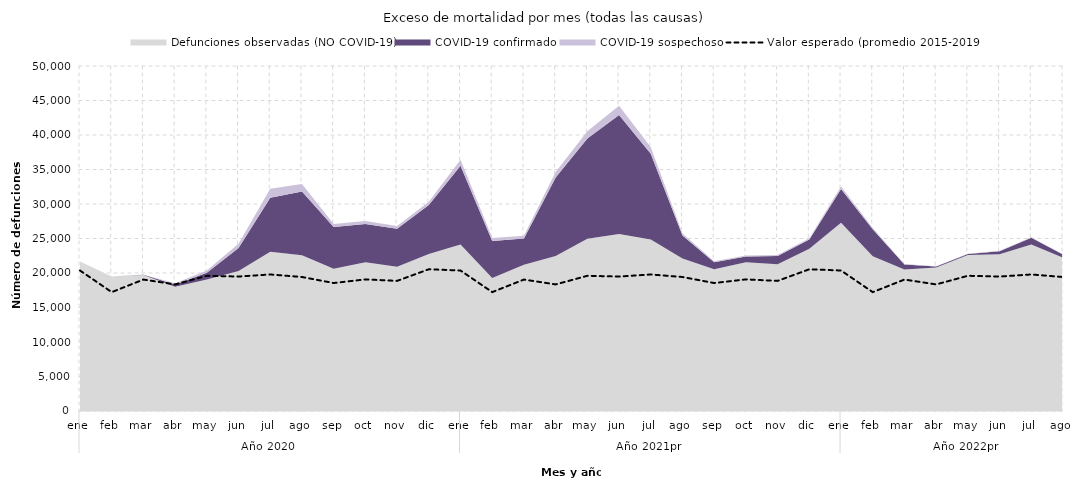
| Category | Valor esperado (promedio 2015-2019) |
|---|---|
| 0 | 20360.6 |
| 1 | 17229.2 |
| 2 | 19050 |
| 3 | 18346.2 |
| 4 | 19594.4 |
| 5 | 19486.2 |
| 6 | 19786.4 |
| 7 | 19420 |
| 8 | 18545.8 |
| 9 | 19074.4 |
| 10 | 18857 |
| 11 | 20542 |
| 12 | 20360.6 |
| 13 | 17229.2 |
| 14 | 19050 |
| 15 | 18346.2 |
| 16 | 19594.4 |
| 17 | 19486.2 |
| 18 | 19786.4 |
| 19 | 19420 |
| 20 | 18545.8 |
| 21 | 19074.4 |
| 22 | 18857 |
| 23 | 20542 |
| 24 | 20360.6 |
| 25 | 17229.2 |
| 26 | 19050 |
| 27 | 18346.2 |
| 28 | 19594.4 |
| 29 | 19486.2 |
| 30 | 19786.4 |
| 31 | 19420 |